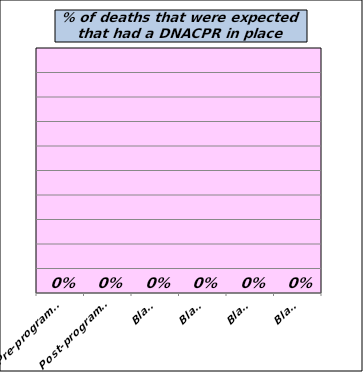
| Category | Yes % |
|---|---|
| Pre-programme | 0 |
| Post-programme | 0 |
| Blank | 0 |
| Blank | 0 |
| Blank | 0 |
| Blank | 0 |